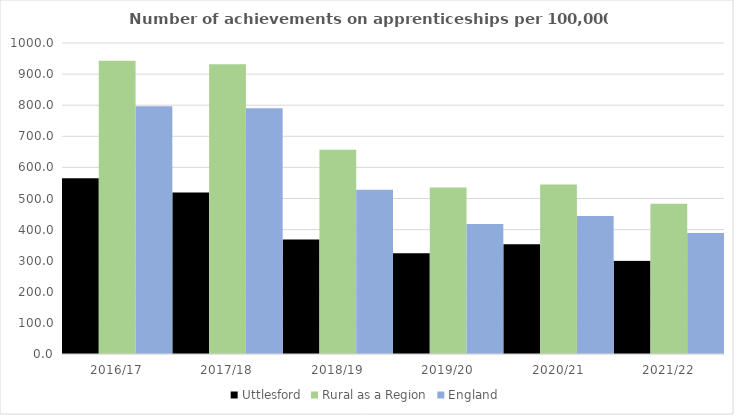
| Category | Uttlesford | Rural as a Region | England |
|---|---|---|---|
| 2016/17 | 565 | 942.594 | 797 |
| 2017/18 | 519 | 931.709 | 790 |
| 2018/19 | 368 | 656.44 | 528 |
| 2019/20 | 324 | 535.552 | 418 |
| 2020/21 | 353 | 545.333 | 444 |
| 2021/22 | 299 | 482.936 | 389 |